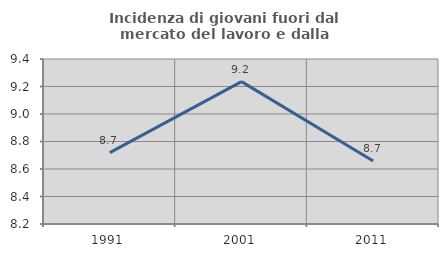
| Category | Incidenza di giovani fuori dal mercato del lavoro e dalla formazione  |
|---|---|
| 1991.0 | 8.719 |
| 2001.0 | 9.236 |
| 2011.0 | 8.658 |